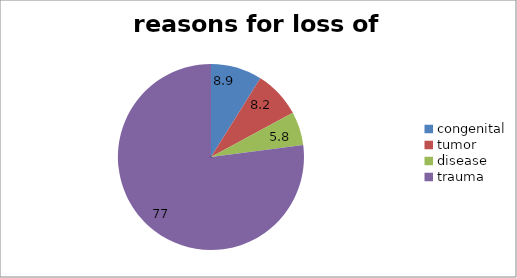
| Category | Series 0 |
|---|---|
| congenital | 8.9 |
| tumor  | 8.2 |
| disease | 5.8 |
| trauma | 77 |